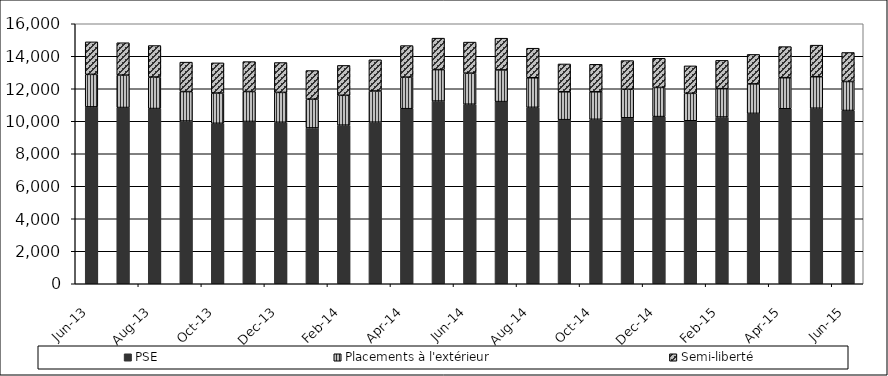
| Category | PSE | Placements à l'extérieur | Semi-liberté |
|---|---|---|---|
| 2013-06-01 | 10886 | 2000 | 2000 |
| 2013-07-01 | 10846 | 1993 | 1993 |
| 2013-08-01 | 10782 | 1939 | 1939 |
| 2013-09-01 | 10013 | 1813 | 1813 |
| 2013-10-01 | 9874 | 1860 | 1860 |
| 2013-11-01 | 9987 | 1842 | 1842 |
| 2013-12-01 | 9938 | 1838 | 1838 |
| 2014-01-01 | 9591 | 1765 | 1765 |
| 2014-02-01 | 9760 | 1838 | 1838 |
| 2014-03-01 | 9943 | 1920 | 1920 |
| 2014-04-01 | 10773 | 1942 | 1942 |
| 2014-05-01 | 11241 | 1937 | 1937 |
| 2014-06-01 | 11048 | 1912 | 1912 |
| 2014-07-01 | 11210 | 1951 | 1951 |
| 2014-08-01 | 10856 | 1820 | 1820 |
| 2014-09-01 | 10098 | 1714 | 1714 |
| 2014-10-01 | 10120 | 1692 | 1692 |
| 2014-11-01 | 10213 | 1760 | 1760 |
| 2014-12-01 | 10287 | 1794 | 1794 |
| 2015-01-01 | 10030 | 1689 | 1689 |
| 2015-02-01 | 10261 | 1743 | 1743 |
| 2015-03-01 | 10485 | 1814 | 1814 |
| 2015-04-01 | 10770 | 1912 | 1912 |
| 2015-05-01 | 10801 | 1941 | 1941 |
| 2015-06-01 | 10662 | 1785 | 1785 |